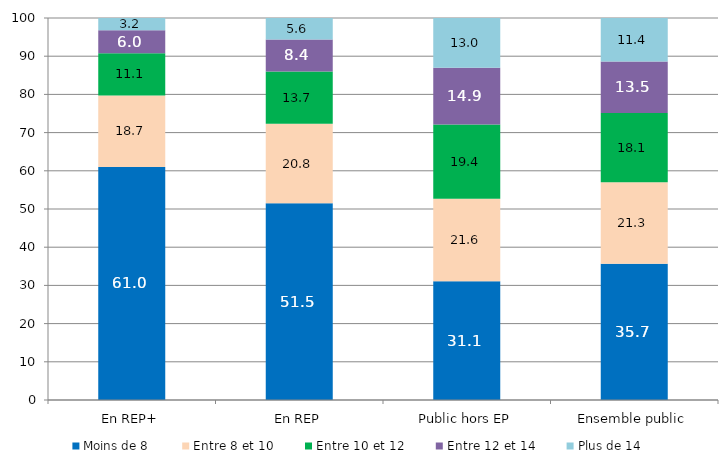
| Category | Moins de 8 | Entre 8 et 10 | Entre 10 et 12 | Entre 12 et 14 | Plus de 14 |
|---|---|---|---|---|---|
| En REP+ | 61 | 18.7 | 11.1 | 6 | 3.2 |
| En REP | 51.5 | 20.8 | 13.7 | 8.4 | 5.6 |
| Public hors EP | 31.1 | 21.6 | 19.4 | 14.9 | 13 |
| Ensemble public | 35.7 | 21.3 | 18.1 | 13.5 | 11.4 |